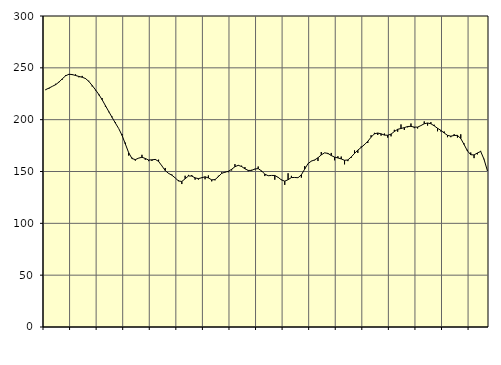
| Category | Piggar | Series 1 |
|---|---|---|
| nan | 228.5 | 228.99 |
| 87.0 | 229.9 | 230.46 |
| 87.0 | 232.1 | 232.12 |
| 87.0 | 234.6 | 233.77 |
| nan | 236.5 | 236.21 |
| 88.0 | 238.6 | 239.39 |
| 88.0 | 243 | 242.3 |
| 88.0 | 243.2 | 243.8 |
| nan | 243 | 243.53 |
| 89.0 | 243.7 | 242.62 |
| 89.0 | 240.9 | 241.7 |
| 89.0 | 242.2 | 240.94 |
| nan | 240.1 | 239.66 |
| 90.0 | 237.5 | 236.91 |
| 90.0 | 232.1 | 232.99 |
| 90.0 | 228.3 | 228.8 |
| nan | 223.6 | 224.38 |
| 91.0 | 220.8 | 219.25 |
| 91.0 | 212.5 | 213.54 |
| 91.0 | 207.2 | 207.82 |
| nan | 203 | 202.2 |
| 92.0 | 197.5 | 196.71 |
| 92.0 | 191.4 | 191.39 |
| 92.0 | 186.1 | 184.88 |
| nan | 177.8 | 176.49 |
| 93.0 | 165.4 | 168.1 |
| 93.0 | 163.3 | 162.52 |
| 93.0 | 160.5 | 161.46 |
| nan | 163 | 162.91 |
| 94.0 | 166.1 | 163.72 |
| 94.0 | 161.3 | 162.6 |
| 94.0 | 160 | 161.07 |
| nan | 160.2 | 161.27 |
| 95.0 | 161.1 | 161.66 |
| 95.0 | 161.4 | 159.78 |
| 95.0 | 155.3 | 155.4 |
| nan | 153.4 | 150.91 |
| 96.0 | 148 | 148.22 |
| 96.0 | 147.1 | 146.48 |
| 96.0 | 143.9 | 143.83 |
| nan | 141.6 | 140.88 |
| 97.0 | 137.9 | 140.37 |
| 97.0 | 145.9 | 142.99 |
| 97.0 | 146.7 | 145.66 |
| nan | 146.6 | 145.6 |
| 98.0 | 142.1 | 143.88 |
| 98.0 | 142.2 | 143.14 |
| 98.0 | 144.3 | 143.97 |
| nan | 142.5 | 144.91 |
| 99.0 | 146.2 | 143.79 |
| 99.0 | 140.5 | 141.96 |
| 99.0 | 141.5 | 142.19 |
| nan | 145.9 | 144.98 |
| 0.0 | 149.2 | 148.2 |
| 0.0 | 149 | 149.38 |
| 0.0 | 149.3 | 150.17 |
| nan | 151 | 152.11 |
| 1.0 | 157.1 | 154.62 |
| 1.0 | 155.6 | 155.96 |
| 1.0 | 155.6 | 154.81 |
| nan | 154.3 | 152.6 |
| 2.0 | 150.2 | 151.04 |
| 2.0 | 151.6 | 151.04 |
| 2.0 | 152 | 152.45 |
| nan | 154.8 | 152.76 |
| 3.0 | 150 | 150.59 |
| 3.0 | 145.6 | 147.49 |
| 3.0 | 145.8 | 145.92 |
| nan | 146.2 | 146.2 |
| 4.0 | 142.1 | 146.15 |
| 4.0 | 144.7 | 144.38 |
| 4.0 | 142.2 | 141.85 |
| nan | 137.1 | 140.7 |
| 5.0 | 148.3 | 142.08 |
| 5.0 | 145.8 | 144.14 |
| 5.0 | 144.3 | 144.23 |
| nan | 144 | 144.01 |
| 6.0 | 144.1 | 146.81 |
| 6.0 | 155.2 | 152.31 |
| 6.0 | 157.4 | 157.58 |
| nan | 160.2 | 160.02 |
| 7.0 | 160.8 | 161.16 |
| 7.0 | 160.1 | 163.24 |
| 7.0 | 168.8 | 166.01 |
| nan | 167.9 | 168 |
| 8.0 | 166.8 | 167.46 |
| 8.0 | 167.9 | 165.4 |
| 8.0 | 160.8 | 163.87 |
| nan | 164.7 | 163.08 |
| 9.0 | 164.4 | 162.14 |
| 9.0 | 156.9 | 160.8 |
| 9.0 | 160 | 161.14 |
| nan | 163.2 | 163.99 |
| 10.0 | 170.3 | 167.44 |
| 10.0 | 167.9 | 170.6 |
| 10.0 | 174.1 | 173.19 |
| nan | 176.5 | 175.88 |
| 11.0 | 177.5 | 179.09 |
| 11.0 | 185 | 183.1 |
| 11.0 | 187.3 | 186.33 |
| nan | 185.2 | 187.13 |
| 12.0 | 184.6 | 186.35 |
| 12.0 | 186.6 | 185.13 |
| 12.0 | 182.7 | 184.95 |
| nan | 183.9 | 186.07 |
| 13.0 | 190.2 | 188.54 |
| 13.0 | 188.4 | 190.72 |
| 13.0 | 195.4 | 191.48 |
| nan | 190.1 | 192.33 |
| 14.0 | 192.6 | 193.4 |
| 14.0 | 196.3 | 193.57 |
| 14.0 | 191.8 | 192.81 |
| nan | 191.5 | 192.8 |
| 15.0 | 194.3 | 194.3 |
| 15.0 | 198.3 | 196.05 |
| 15.0 | 194.3 | 196.79 |
| nan | 197.6 | 196.07 |
| 16.0 | 195.1 | 194.05 |
| 16.0 | 188.8 | 191.72 |
| 16.0 | 188.6 | 189.68 |
| nan | 188.6 | 187.18 |
| 17.0 | 183.1 | 184.88 |
| 17.0 | 183.1 | 184.08 |
| 17.0 | 186 | 184.75 |
| nan | 182.7 | 184.85 |
| 18.0 | 185.9 | 181.82 |
| 18.0 | 177.1 | 176.07 |
| 18.0 | 170.9 | 169.91 |
| nan | 168.3 | 166.18 |
| 19.0 | 162.9 | 166 |
| 19.0 | 166.5 | 167.87 |
| 19.0 | 169.9 | 169.35 |
| nan | 162.2 | 161.77 |
| 20.0 | 150.5 | 150.99 |